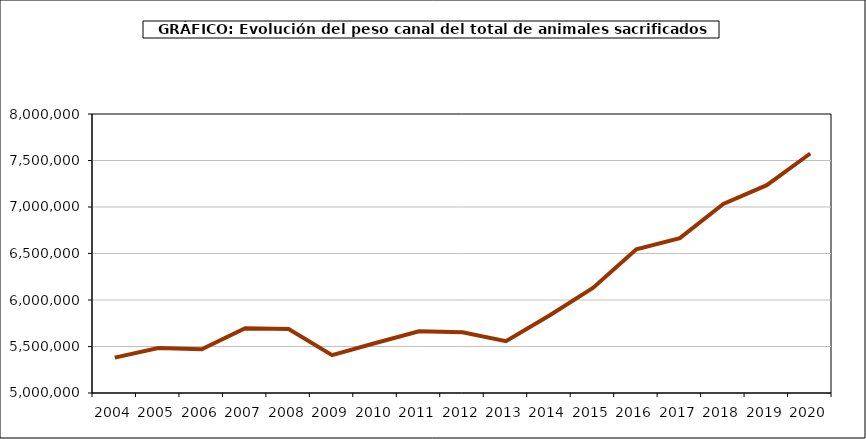
| Category | Series 0 |
|---|---|
| 2004.0 | 5380320.91 |
| 2005.0 | 5484133.682 |
| 2006.0 | 5469928.516 |
| 2007.0 | 5697170.115 |
| 2008.0 | 5687912.363 |
| 2009.0 | 5406476.675 |
| 2010.0 | 5537415.454 |
| 2011.0 | 5664197.217 |
| 2012.0 | 5653769.803 |
| 2013.0 | 5556795.031 |
| 2014.0 | 5833789.68 |
| 2015.0 | 6129137.234 |
| 2016.0 | 6544369.423 |
| 2017.0 | 6665614.034 |
| 2018.0 | 7032931.593 |
| 2019.0 | 7235051.281 |
| 2020.0 | 7575219.284 |